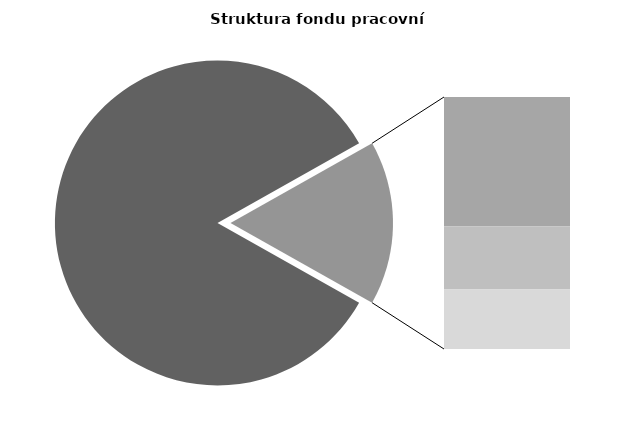
| Category | Series 0 |
|---|---|
| Průměrná měsíční odpracovaná doba bez přesčasu | 141.746 |
| Dovolená | 14.169 |
| Nemoc | 6.967 |
| Jiné | 6.516 |